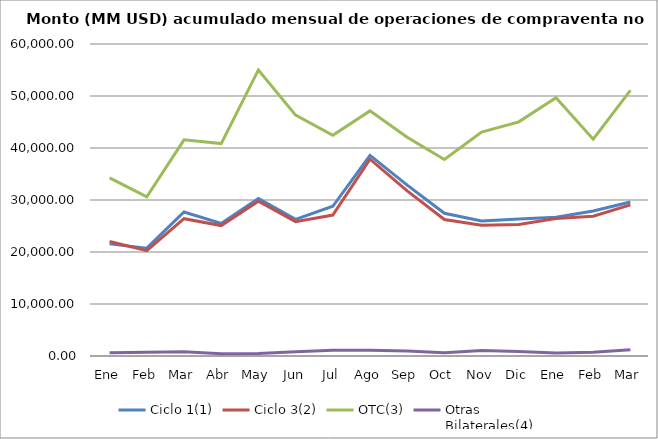
| Category | Ciclo 1(1) | Ciclo 3(2) | OTC(3) | Otras
Bilaterales(4) |
|---|---|---|---|---|
| Ene | 21560.845 | 22006.263 | 34254.398 | 624.056 |
| Feb | 20737.718 | 20259.785 | 30608.69 | 712.264 |
| Mar | 27689.104 | 26406.62 | 41565.587 | 816.585 |
| Abr | 25498.246 | 25078.47 | 40852.33 | 436.254 |
| May | 30280.552 | 29764.507 | 55013.217 | 477.268 |
| Jun | 26273.456 | 25834.982 | 46322.278 | 822.103 |
| Jul | 28792.81 | 27110.407 | 42437.363 | 1120.336 |
| Ago | 38596.016 | 37859.307 | 47136.271 | 1125.276 |
| Sep | 32864.424 | 31763.783 | 42068.964 | 961.025 |
| Oct | 27455.978 | 26253.656 | 37797.763 | 641.922 |
| Nov | 25962.062 | 25132.899 | 43076.937 | 1073.553 |
| Dic | 26367.07 | 25279.098 | 45022.478 | 878.171 |
| Ene | 26687.919 | 26451.759 | 49648.745 | 557.298 |
| Feb | 27881.584 | 26876.104 | 41680.35 | 743.398 |
| Mar | 29614.61 | 29066.765 | 51077.62 | 1203.543 |